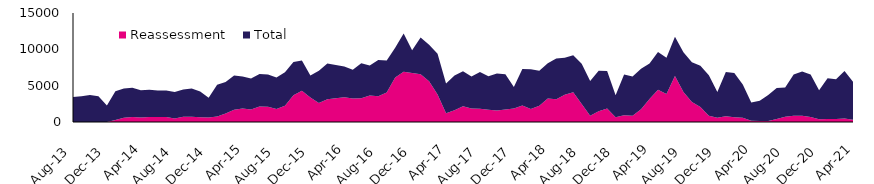
| Category | Reassessment | Total |
|---|---|---|
| 2013-08-01 | 6 | 3441 |
| 2013-09-01 | 13 | 3531 |
| 2013-10-01 | 12 | 3711 |
| 2013-11-01 | 11 | 3530 |
| 2013-12-01 | 6 | 2262 |
| 2014-01-01 | 288 | 3928 |
| 2014-02-01 | 578 | 4037 |
| 2014-03-01 | 700 | 4003 |
| 2014-04-01 | 612 | 3757 |
| 2014-05-01 | 691 | 3747 |
| 2014-06-01 | 689 | 3636 |
| 2014-07-01 | 686 | 3642 |
| 2014-08-01 | 470 | 3647 |
| 2014-09-01 | 714 | 3769 |
| 2014-10-01 | 728 | 3881 |
| 2014-11-01 | 638 | 3555 |
| 2014-12-01 | 629 | 2701 |
| 2015-01-01 | 762 | 4369 |
| 2015-02-01 | 1158 | 4331 |
| 2015-03-01 | 1698 | 4684 |
| 2015-04-01 | 1844 | 4412 |
| 2015-05-01 | 1727 | 4245 |
| 2015-06-01 | 2119 | 4491 |
| 2015-07-01 | 2084 | 4441 |
| 2015-08-01 | 1780 | 4334 |
| 2015-09-01 | 2232 | 4624 |
| 2015-10-01 | 3679 | 4593 |
| 2015-11-01 | 4294 | 4173 |
| 2015-12-01 | 3383 | 3030 |
| 2016-01-01 | 2621 | 4444 |
| 2016-02-01 | 3145 | 4897 |
| 2016-03-01 | 3280 | 4566 |
| 2016-04-01 | 3410 | 4234 |
| 2016-05-01 | 3243 | 3961 |
| 2016-06-01 | 3260 | 4827 |
| 2016-07-01 | 3632 | 4146 |
| 2016-08-01 | 3543 | 5004 |
| 2016-09-01 | 4058 | 4395 |
| 2016-10-01 | 6138 | 4071 |
| 2016-11-01 | 6916 | 5265 |
| 2016-12-01 | 6755 | 3115 |
| 2017-01-01 | 6574 | 5046 |
| 2017-02-01 | 5611 | 5022 |
| 2017-03-01 | 3777 | 5602 |
| 2017-04-01 | 1207 | 4080 |
| 2017-05-01 | 1614 | 4799 |
| 2017-06-01 | 2151 | 4841 |
| 2017-07-01 | 1867 | 4408 |
| 2017-08-01 | 1807 | 5061 |
| 2017-09-01 | 1670 | 4612 |
| 2017-10-01 | 1599 | 5072 |
| 2017-11-01 | 1711 | 4875 |
| 2017-12-01 | 1848 | 2960 |
| 2018-01-01 | 2270 | 5016 |
| 2018-02-01 | 1789 | 5461 |
| 2018-03-01 | 2253 | 4798 |
| 2018-04-01 | 3220 | 4878 |
| 2018-05-01 | 3128 | 5617 |
| 2018-06-01 | 3760 | 5071 |
| 2018-07-01 | 4080 | 5090 |
| 2018-08-01 | 2473 | 5527 |
| 2018-09-01 | 868 | 4791 |
| 2018-10-01 | 1466 | 5576 |
| 2018-11-01 | 1850 | 5179 |
| 2018-12-01 | 648 | 3031 |
| 2019-01-01 | 917 | 5614 |
| 2019-02-01 | 857 | 5401 |
| 2019-03-01 | 1763 | 5553 |
| 2019-04-01 | 3160 | 4905 |
| 2019-05-01 | 4423 | 5219 |
| 2019-06-01 | 3849 | 4985 |
| 2019-07-01 | 6320 | 5425 |
| 2019-08-01 | 4128 | 5480 |
| 2019-09-01 | 2753 | 5486 |
| 2019-10-01 | 2062 | 5663 |
| 2019-11-01 | 857 | 5585 |
| 2019-12-01 | 599 | 3537 |
| 2020-01-01 | 796 | 6080 |
| 2020-02-01 | 650 | 6079 |
| 2020-03-01 | 578 | 4577 |
| 2020-04-01 | 165 | 2531 |
| 2020-05-01 | 143 | 2784 |
| 2020-06-01 | 151 | 3570 |
| 2020-07-01 | 416 | 4252 |
| 2020-08-01 | 736 | 3997 |
| 2020-09-01 | 869 | 5674 |
| 2020-10-01 | 847 | 6104 |
| 2020-11-01 | 680 | 5845 |
| 2020-12-01 | 383 | 3986 |
| 2021-01-01 | 410 | 5614 |
| 2021-02-01 | 412 | 5487 |
| 2021-03-01 | 491 | 6512 |
| 2021-04-01 | 307 | 5224 |